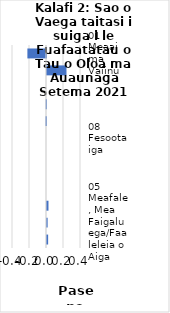
| Category |     Contributions |
|---|---|
| 01 Meaai ma Vaiinu | -0.219 |
| 07 Femalagaiga | 0.229 |
| 11 Faleaiga | 0 |
| 03 Lavalava ma Seevae | -0.004 |
| 12 Isi Oloa ma Auaunaga | -0.007 |
| 08 Fesootaiga | 0 |
| 09 Faafiafiaga ma Aganuu | 0 |
| 06 Soifua Maloloina | 0 |
| 10 Aoaoga | 0 |
| 02 Ava Malosi ma Tapaa | 0.017 |
| 05 Meafale, Mea Faigaluega/Faaleleia o Aiga | 0.008 |
| 04 Fale, Suavai, Eletise, Kesi ma isi | 0.013 |